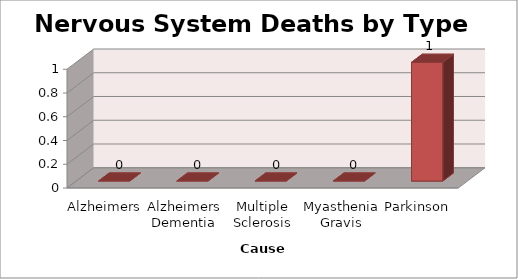
| Category | Series 0 |
|---|---|
| Alzheimers | 0 |
| Alzheimers Dementia | 0 |
| Multiple Sclerosis | 0 |
| Myasthenia Gravis | 0 |
| Parkinson | 1 |